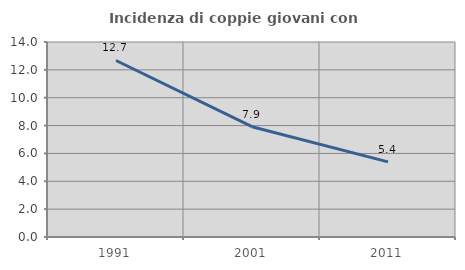
| Category | Incidenza di coppie giovani con figli |
|---|---|
| 1991.0 | 12.673 |
| 2001.0 | 7.917 |
| 2011.0 | 5.396 |